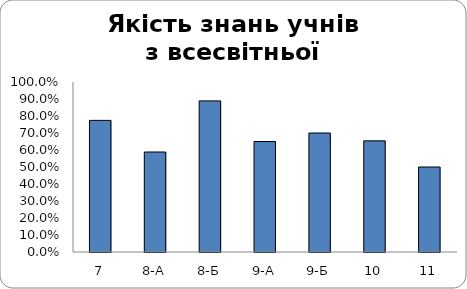
| Category | Series 0 |
|---|---|
| 7 | 0.774 |
| 8-А | 0.588 |
| 8-Б | 0.889 |
| 9-А | 0.65 |
| 9-Б | 0.7 |
| 10 | 0.654 |
| 11 | 0.5 |